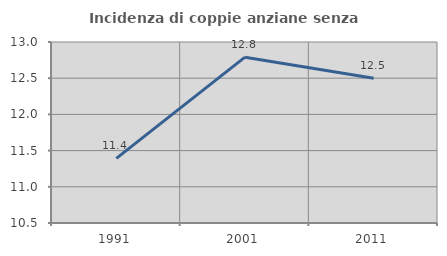
| Category | Incidenza di coppie anziane senza figli  |
|---|---|
| 1991.0 | 11.392 |
| 2001.0 | 12.791 |
| 2011.0 | 12.5 |